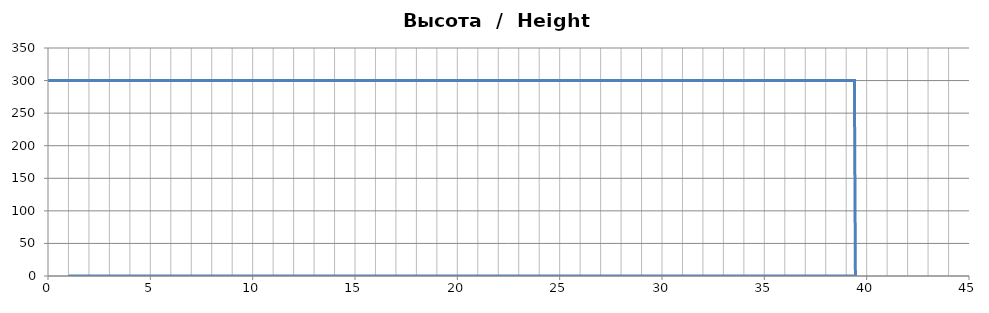
| Category | Высота  /  Height [m] |
|---|---|
| 0.0 | 300 |
| 0.05 | 300 |
| 0.1 | 300 |
| 0.15000000000000002 | 300 |
| 0.2 | 300 |
| 0.25 | 300 |
| 0.3 | 300 |
| 0.35 | 300 |
| 0.39999999999999997 | 300 |
| 0.44999999999999996 | 300 |
| 0.49999999999999994 | 300 |
| 0.5499999999999999 | 300 |
| 0.6 | 300 |
| 0.65 | 300 |
| 0.7000000000000001 | 300 |
| 0.7500000000000001 | 300 |
| 0.8000000000000002 | 300 |
| 0.8500000000000002 | 300 |
| 0.9000000000000002 | 300 |
| 0.9500000000000003 | 300 |
| 1.0000000000000002 | 300 |
| 1.0500000000000003 | 300 |
| 1.1000000000000003 | 300 |
| 1.1500000000000004 | 300 |
| 1.2000000000000004 | 300 |
| 1.2500000000000004 | 300 |
| 1.3000000000000005 | 300 |
| 1.3500000000000005 | 300 |
| 1.4000000000000006 | 300 |
| 1.4500000000000006 | 300 |
| 1.5000000000000007 | 300 |
| 1.5500000000000007 | 300 |
| 1.6000000000000008 | 300 |
| 1.6500000000000008 | 300 |
| 1.7000000000000008 | 300 |
| 1.7500000000000009 | 300 |
| 1.800000000000001 | 300 |
| 1.850000000000001 | 300 |
| 1.900000000000001 | 300 |
| 1.950000000000001 | 300 |
| 2.000000000000001 | 300 |
| 2.0500000000000007 | 300 |
| 2.1000000000000005 | 300 |
| 2.1500000000000004 | 300 |
| 2.2 | 300 |
| 2.25 | 300 |
| 2.3 | 300 |
| 2.3499999999999996 | 300 |
| 2.3999999999999995 | 300 |
| 2.4499999999999993 | 300 |
| 2.499999999999999 | 300 |
| 2.549999999999999 | 300 |
| 2.5999999999999988 | 300 |
| 2.6499999999999986 | 300 |
| 2.6999999999999984 | 300 |
| 2.7499999999999982 | 300 |
| 2.799999999999998 | 300 |
| 2.849999999999998 | 300 |
| 2.8999999999999977 | 300 |
| 2.9499999999999975 | 300 |
| 2.9999999999999973 | 300 |
| 3.049999999999997 | 300 |
| 3.099999999999997 | 300 |
| 3.149999999999997 | 300 |
| 3.1999999999999966 | 300 |
| 3.2499999999999964 | 300 |
| 3.2999999999999963 | 300 |
| 3.349999999999996 | 300 |
| 3.399999999999996 | 300 |
| 3.4499999999999957 | 300 |
| 3.4999999999999956 | 300 |
| 3.5499999999999954 | 300 |
| 3.599999999999995 | 300 |
| 3.649999999999995 | 300 |
| 3.699999999999995 | 300 |
| 3.7499999999999947 | 300 |
| 3.7999999999999945 | 300 |
| 3.8499999999999943 | 300 |
| 3.899999999999994 | 300 |
| 3.949999999999994 | 300 |
| 3.999999999999994 | 300 |
| 4.049999999999994 | 300 |
| 4.099999999999993 | 300 |
| 4.149999999999993 | 300 |
| 4.199999999999993 | 300 |
| 4.249999999999993 | 300 |
| 4.299999999999993 | 300 |
| 4.3499999999999925 | 300 |
| 4.399999999999992 | 300 |
| 4.449999999999992 | 300 |
| 4.499999999999992 | 300 |
| 4.549999999999992 | 300 |
| 4.599999999999992 | 300 |
| 4.6499999999999915 | 300 |
| 4.699999999999991 | 300 |
| 4.749999999999991 | 300 |
| 4.799999999999991 | 300 |
| 4.849999999999991 | 300 |
| 4.899999999999991 | 300 |
| 4.94999999999999 | 300 |
| 4.99999999999999 | 300 |
| 5.04999999999999 | 300 |
| 5.09999999999999 | 300 |
| 5.14999999999999 | 300 |
| 5.1999999999999895 | 300 |
| 5.249999999999989 | 300 |
| 5.299999999999989 | 300 |
| 5.349999999999989 | 300 |
| 5.399999999999989 | 300 |
| 5.449999999999989 | 300 |
| 5.4999999999999885 | 300 |
| 5.549999999999988 | 300 |
| 5.599999999999988 | 300 |
| 5.649999999999988 | 300 |
| 5.699999999999988 | 300 |
| 5.749999999999988 | 300 |
| 5.799999999999987 | 300 |
| 5.849999999999987 | 300 |
| 5.899999999999987 | 300 |
| 5.949999999999987 | 300 |
| 5.999999999999987 | 300 |
| 6.0499999999999865 | 300 |
| 6.099999999999986 | 300 |
| 6.149999999999986 | 300 |
| 6.199999999999986 | 300 |
| 6.249999999999986 | 300 |
| 6.299999999999986 | 300 |
| 6.349999999999985 | 300 |
| 6.399999999999985 | 300 |
| 6.449999999999985 | 300 |
| 6.499999999999985 | 300 |
| 6.549999999999985 | 300 |
| 6.5999999999999845 | 300 |
| 6.649999999999984 | 300 |
| 6.699999999999984 | 300 |
| 6.749999999999984 | 300 |
| 6.799999999999984 | 300 |
| 6.849999999999984 | 300 |
| 6.8999999999999835 | 300 |
| 6.949999999999983 | 300 |
| 6.999999999999983 | 300 |
| 7.049999999999983 | 300 |
| 7.099999999999983 | 300 |
| 7.149999999999983 | 300 |
| 7.199999999999982 | 300 |
| 7.249999999999982 | 300 |
| 7.299999999999982 | 300 |
| 7.349999999999982 | 300 |
| 7.399999999999982 | 300 |
| 7.4499999999999815 | 300 |
| 7.499999999999981 | 300 |
| 7.549999999999981 | 300 |
| 7.599999999999981 | 300 |
| 7.649999999999981 | 300 |
| 7.699999999999981 | 300 |
| 7.7499999999999805 | 300 |
| 7.79999999999998 | 300 |
| 7.84999999999998 | 300 |
| 7.89999999999998 | 300 |
| 7.94999999999998 | 300 |
| 7.99999999999998 | 300 |
| 8.04999999999998 | 300 |
| 8.09999999999998 | 300 |
| 8.14999999999998 | 300 |
| 8.199999999999982 | 300 |
| 8.249999999999982 | 300 |
| 8.299999999999983 | 300 |
| 8.349999999999984 | 300 |
| 8.399999999999984 | 300 |
| 8.449999999999985 | 300 |
| 8.499999999999986 | 300 |
| 8.549999999999986 | 300 |
| 8.599999999999987 | 300 |
| 8.649999999999988 | 300 |
| 8.699999999999989 | 300 |
| 8.74999999999999 | 300 |
| 8.79999999999999 | 300 |
| 8.84999999999999 | 300 |
| 8.899999999999991 | 300 |
| 8.949999999999992 | 300 |
| 8.999999999999993 | 300 |
| 9.049999999999994 | 300 |
| 9.099999999999994 | 300 |
| 9.149999999999995 | 300 |
| 9.199999999999996 | 300 |
| 9.249999999999996 | 300 |
| 9.299999999999997 | 300 |
| 9.349999999999998 | 300 |
| 9.399999999999999 | 300 |
| 9.45 | 300 |
| 9.5 | 300 |
| 9.55 | 300 |
| 9.600000000000001 | 300 |
| 9.650000000000002 | 300 |
| 9.700000000000003 | 300 |
| 9.750000000000004 | 300 |
| 9.800000000000004 | 300 |
| 9.850000000000005 | 300 |
| 9.900000000000006 | 300 |
| 9.950000000000006 | 300 |
| 10.000000000000007 | 300 |
| 10.050000000000008 | 300 |
| 10.100000000000009 | 300 |
| 10.15000000000001 | 300 |
| 10.20000000000001 | 300 |
| 10.25000000000001 | 300 |
| 10.300000000000011 | 300 |
| 10.350000000000012 | 300 |
| 10.400000000000013 | 300 |
| 10.450000000000014 | 300 |
| 10.500000000000014 | 300 |
| 10.550000000000015 | 300 |
| 10.600000000000016 | 300 |
| 10.650000000000016 | 300 |
| 10.700000000000017 | 300 |
| 10.750000000000018 | 300 |
| 10.800000000000018 | 300 |
| 10.85000000000002 | 300 |
| 10.90000000000002 | 300 |
| 10.95000000000002 | 300 |
| 11.000000000000021 | 300 |
| 11.050000000000022 | 300 |
| 11.100000000000023 | 300 |
| 11.150000000000023 | 300 |
| 11.200000000000024 | 300 |
| 11.250000000000025 | 300 |
| 11.300000000000026 | 300 |
| 11.350000000000026 | 300 |
| 11.400000000000027 | 300 |
| 11.450000000000028 | 300 |
| 11.500000000000028 | 300 |
| 11.55000000000003 | 300 |
| 11.60000000000003 | 300 |
| 11.65000000000003 | 300 |
| 11.700000000000031 | 300 |
| 11.750000000000032 | 300 |
| 11.800000000000033 | 300 |
| 11.850000000000033 | 300 |
| 11.900000000000034 | 300 |
| 11.950000000000035 | 300 |
| 12.000000000000036 | 300 |
| 12.050000000000036 | 300 |
| 12.100000000000037 | 300 |
| 12.150000000000038 | 300 |
| 12.200000000000038 | 300 |
| 12.250000000000039 | 300 |
| 12.30000000000004 | 300 |
| 12.35000000000004 | 300 |
| 12.400000000000041 | 300 |
| 12.450000000000042 | 300 |
| 12.500000000000043 | 300 |
| 12.550000000000043 | 300 |
| 12.600000000000044 | 300 |
| 12.650000000000045 | 300 |
| 12.700000000000045 | 300 |
| 12.750000000000046 | 300 |
| 12.800000000000047 | 300 |
| 12.850000000000048 | 300 |
| 12.900000000000048 | 300 |
| 12.950000000000049 | 300 |
| 13.00000000000005 | 300 |
| 13.05000000000005 | 300 |
| 13.100000000000051 | 300 |
| 13.150000000000052 | 300 |
| 13.200000000000053 | 300 |
| 13.250000000000053 | 300 |
| 13.300000000000054 | 300 |
| 13.350000000000055 | 300 |
| 13.400000000000055 | 300 |
| 13.450000000000056 | 300 |
| 13.500000000000057 | 300 |
| 13.550000000000058 | 300 |
| 13.600000000000058 | 300 |
| 13.650000000000059 | 300 |
| 13.70000000000006 | 300 |
| 13.75000000000006 | 300 |
| 13.800000000000061 | 300 |
| 13.850000000000062 | 300 |
| 13.900000000000063 | 300 |
| 13.950000000000063 | 300 |
| 14.000000000000064 | 300 |
| 14.050000000000065 | 300 |
| 14.100000000000065 | 300 |
| 14.150000000000066 | 300 |
| 14.200000000000067 | 300 |
| 14.250000000000068 | 300 |
| 14.300000000000068 | 300 |
| 14.350000000000069 | 300 |
| 14.40000000000007 | 300 |
| 14.45000000000007 | 300 |
| 14.500000000000071 | 300 |
| 14.550000000000072 | 300 |
| 14.600000000000072 | 300 |
| 14.650000000000073 | 300 |
| 14.700000000000074 | 300 |
| 14.750000000000075 | 300 |
| 14.800000000000075 | 300 |
| 14.850000000000076 | 300 |
| 14.900000000000077 | 300 |
| 14.950000000000077 | 300 |
| 15.000000000000078 | 300 |
| 15.050000000000079 | 300 |
| 15.10000000000008 | 300 |
| 15.15000000000008 | 300 |
| 15.200000000000081 | 300 |
| 15.250000000000082 | 300 |
| 15.300000000000082 | 300 |
| 15.350000000000083 | 300 |
| 15.400000000000084 | 300 |
| 15.450000000000085 | 300 |
| 15.500000000000085 | 300 |
| 15.550000000000086 | 300 |
| 15.600000000000087 | 300 |
| 15.650000000000087 | 300 |
| 15.700000000000088 | 300 |
| 15.750000000000089 | 300 |
| 15.80000000000009 | 300 |
| 15.85000000000009 | 300 |
| 15.900000000000091 | 300 |
| 15.950000000000092 | 300 |
| 16.000000000000092 | 300 |
| 16.050000000000093 | 300 |
| 16.100000000000094 | 300 |
| 16.150000000000095 | 300 |
| 16.200000000000095 | 300 |
| 16.250000000000096 | 300 |
| 16.300000000000097 | 300 |
| 16.350000000000097 | 300 |
| 16.400000000000098 | 300 |
| 16.4500000000001 | 300 |
| 16.5000000000001 | 300 |
| 16.5500000000001 | 300 |
| 16.6000000000001 | 300 |
| 16.6500000000001 | 300 |
| 16.700000000000102 | 300 |
| 16.750000000000103 | 300 |
| 16.800000000000104 | 300 |
| 16.850000000000104 | 300 |
| 16.900000000000105 | 300 |
| 16.950000000000106 | 300 |
| 17.000000000000107 | 300 |
| 17.050000000000107 | 300 |
| 17.100000000000108 | 300 |
| 17.15000000000011 | 300 |
| 17.20000000000011 | 300 |
| 17.25000000000011 | 300 |
| 17.30000000000011 | 300 |
| 17.35000000000011 | 300 |
| 17.400000000000112 | 300 |
| 17.450000000000113 | 300 |
| 17.500000000000114 | 300 |
| 17.550000000000114 | 300 |
| 17.600000000000115 | 300 |
| 17.650000000000116 | 300 |
| 17.700000000000117 | 300 |
| 17.750000000000117 | 300 |
| 17.800000000000118 | 300 |
| 17.85000000000012 | 300 |
| 17.90000000000012 | 300 |
| 17.95000000000012 | 300 |
| 18.00000000000012 | 300 |
| 18.05000000000012 | 300 |
| 18.100000000000122 | 300 |
| 18.150000000000123 | 300 |
| 18.200000000000124 | 300 |
| 18.250000000000124 | 300 |
| 18.300000000000125 | 300 |
| 18.350000000000126 | 300 |
| 18.400000000000126 | 300 |
| 18.450000000000127 | 300 |
| 18.500000000000128 | 300 |
| 18.55000000000013 | 300 |
| 18.60000000000013 | 300 |
| 18.65000000000013 | 300 |
| 18.70000000000013 | 300 |
| 18.75000000000013 | 300 |
| 18.800000000000132 | 300 |
| 18.850000000000133 | 300 |
| 18.900000000000134 | 300 |
| 18.950000000000134 | 300 |
| 19.000000000000135 | 300 |
| 19.050000000000136 | 300 |
| 19.100000000000136 | 300 |
| 19.150000000000137 | 300 |
| 19.200000000000138 | 300 |
| 19.25000000000014 | 300 |
| 19.30000000000014 | 300 |
| 19.35000000000014 | 300 |
| 19.40000000000014 | 300 |
| 19.45000000000014 | 300 |
| 19.500000000000142 | 300 |
| 19.550000000000143 | 300 |
| 19.600000000000144 | 300 |
| 19.650000000000144 | 300 |
| 19.700000000000145 | 300 |
| 19.750000000000146 | 300 |
| 19.800000000000146 | 300 |
| 19.850000000000147 | 300 |
| 19.900000000000148 | 300 |
| 19.95000000000015 | 300 |
| 20.00000000000015 | 300 |
| 20.05000000000015 | 300 |
| 20.10000000000015 | 300 |
| 20.15000000000015 | 300 |
| 20.200000000000152 | 300 |
| 20.250000000000153 | 300 |
| 20.300000000000153 | 300 |
| 20.350000000000154 | 300 |
| 20.400000000000155 | 300 |
| 20.450000000000156 | 300 |
| 20.500000000000156 | 300 |
| 20.550000000000157 | 300 |
| 20.600000000000158 | 300 |
| 20.65000000000016 | 300 |
| 20.70000000000016 | 300 |
| 20.75000000000016 | 300 |
| 20.80000000000016 | 300 |
| 20.85000000000016 | 300 |
| 20.900000000000162 | 300 |
| 20.950000000000163 | 300 |
| 21.000000000000163 | 300 |
| 21.050000000000164 | 300 |
| 21.100000000000165 | 300 |
| 21.150000000000166 | 300 |
| 21.200000000000166 | 300 |
| 21.250000000000167 | 300 |
| 21.300000000000168 | 300 |
| 21.35000000000017 | 300 |
| 21.40000000000017 | 300 |
| 21.45000000000017 | 300 |
| 21.50000000000017 | 300 |
| 21.55000000000017 | 300 |
| 21.600000000000172 | 300 |
| 21.650000000000173 | 300 |
| 21.700000000000173 | 300 |
| 21.750000000000174 | 300 |
| 21.800000000000175 | 300 |
| 21.850000000000176 | 300 |
| 21.900000000000176 | 300 |
| 21.950000000000177 | 300 |
| 22.000000000000178 | 300 |
| 22.05000000000018 | 300 |
| 22.10000000000018 | 300 |
| 22.15000000000018 | 300 |
| 22.20000000000018 | 300 |
| 22.25000000000018 | 300 |
| 22.300000000000182 | 300 |
| 22.350000000000183 | 300 |
| 22.400000000000183 | 300 |
| 22.450000000000184 | 300 |
| 22.500000000000185 | 300 |
| 22.550000000000185 | 300 |
| 22.600000000000186 | 300 |
| 22.650000000000187 | 300 |
| 22.700000000000188 | 300 |
| 22.75000000000019 | 300 |
| 22.80000000000019 | 300 |
| 22.85000000000019 | 300 |
| 22.90000000000019 | 300 |
| 22.95000000000019 | 300 |
| 23.000000000000192 | 300 |
| 23.050000000000193 | 300 |
| 23.100000000000193 | 300 |
| 23.150000000000194 | 300 |
| 23.200000000000195 | 300 |
| 23.250000000000195 | 300 |
| 23.300000000000196 | 300 |
| 23.350000000000197 | 300 |
| 23.400000000000198 | 300 |
| 23.4500000000002 | 300 |
| 23.5000000000002 | 300 |
| 23.5500000000002 | 300 |
| 23.6000000000002 | 300 |
| 23.6500000000002 | 300 |
| 23.700000000000202 | 300 |
| 23.750000000000203 | 300 |
| 23.800000000000203 | 300 |
| 23.850000000000204 | 300 |
| 23.900000000000205 | 300 |
| 23.950000000000205 | 300 |
| 24.000000000000206 | 300 |
| 24.050000000000207 | 300 |
| 24.100000000000207 | 300 |
| 24.150000000000208 | 300 |
| 24.20000000000021 | 300 |
| 24.25000000000021 | 300 |
| 24.30000000000021 | 300 |
| 24.35000000000021 | 300 |
| 24.40000000000021 | 300 |
| 24.450000000000212 | 300 |
| 24.500000000000213 | 300 |
| 24.550000000000214 | 300 |
| 24.600000000000215 | 300 |
| 24.650000000000215 | 300 |
| 24.700000000000216 | 300 |
| 24.750000000000217 | 300 |
| 24.800000000000217 | 300 |
| 24.850000000000218 | 300 |
| 24.90000000000022 | 300 |
| 24.95000000000022 | 300 |
| 25.00000000000022 | 300 |
| 25.05000000000022 | 300 |
| 25.10000000000022 | 300 |
| 25.150000000000222 | 300 |
| 25.200000000000223 | 300 |
| 25.250000000000224 | 300 |
| 25.300000000000225 | 300 |
| 25.350000000000225 | 300 |
| 25.400000000000226 | 300 |
| 25.450000000000227 | 300 |
| 25.500000000000227 | 300 |
| 25.550000000000228 | 300 |
| 25.60000000000023 | 300 |
| 25.65000000000023 | 300 |
| 25.70000000000023 | 300 |
| 25.75000000000023 | 300 |
| 25.80000000000023 | 300 |
| 25.850000000000232 | 300 |
| 25.900000000000233 | 300 |
| 25.950000000000234 | 300 |
| 26.000000000000234 | 300 |
| 26.050000000000235 | 300 |
| 26.100000000000236 | 300 |
| 26.150000000000237 | 300 |
| 26.200000000000237 | 300 |
| 26.250000000000238 | 300 |
| 26.30000000000024 | 300 |
| 26.35000000000024 | 300 |
| 26.40000000000024 | 300 |
| 26.45000000000024 | 300 |
| 26.50000000000024 | 300 |
| 26.550000000000242 | 300 |
| 26.600000000000243 | 300 |
| 26.650000000000244 | 300 |
| 26.700000000000244 | 300 |
| 26.750000000000245 | 300 |
| 26.800000000000246 | 300 |
| 26.850000000000247 | 300 |
| 26.900000000000247 | 300 |
| 26.950000000000248 | 300 |
| 27.00000000000025 | 300 |
| 27.05000000000025 | 300 |
| 27.10000000000025 | 300 |
| 27.15000000000025 | 300 |
| 27.20000000000025 | 300 |
| 27.250000000000252 | 300 |
| 27.300000000000253 | 300 |
| 27.350000000000254 | 300 |
| 27.400000000000254 | 300 |
| 27.450000000000255 | 300 |
| 27.500000000000256 | 300 |
| 27.550000000000257 | 300 |
| 27.600000000000257 | 300 |
| 27.650000000000258 | 300 |
| 27.70000000000026 | 300 |
| 27.75000000000026 | 300 |
| 27.80000000000026 | 300 |
| 27.85000000000026 | 300 |
| 27.90000000000026 | 300 |
| 27.950000000000262 | 300 |
| 28.000000000000263 | 300 |
| 28.050000000000264 | 300 |
| 28.100000000000264 | 300 |
| 28.150000000000265 | 300 |
| 28.200000000000266 | 300 |
| 28.250000000000266 | 300 |
| 28.300000000000267 | 300 |
| 28.350000000000268 | 300 |
| 28.40000000000027 | 300 |
| 28.45000000000027 | 300 |
| 28.50000000000027 | 300 |
| 28.55000000000027 | 300 |
| 28.60000000000027 | 300 |
| 28.650000000000272 | 300 |
| 28.700000000000273 | 300 |
| 28.750000000000274 | 300 |
| 28.800000000000274 | 300 |
| 28.850000000000275 | 300 |
| 28.900000000000276 | 300 |
| 28.950000000000276 | 300 |
| 29.000000000000277 | 300 |
| 29.050000000000278 | 300 |
| 29.10000000000028 | 300 |
| 29.15000000000028 | 300 |
| 29.20000000000028 | 300 |
| 29.25000000000028 | 300 |
| 29.30000000000028 | 300 |
| 29.350000000000282 | 300 |
| 29.400000000000283 | 300 |
| 29.450000000000284 | 300 |
| 29.500000000000284 | 300 |
| 29.550000000000285 | 300 |
| 29.600000000000286 | 300 |
| 29.650000000000286 | 300 |
| 29.700000000000287 | 300 |
| 29.750000000000288 | 300 |
| 29.80000000000029 | 300 |
| 29.85000000000029 | 300 |
| 29.90000000000029 | 300 |
| 29.95000000000029 | 300 |
| 30.00000000000029 | 300 |
| 30.050000000000292 | 300 |
| 30.100000000000293 | 300 |
| 30.150000000000293 | 300 |
| 30.200000000000294 | 300 |
| 30.250000000000295 | 300 |
| 30.300000000000296 | 300 |
| 30.350000000000296 | 300 |
| 30.400000000000297 | 300 |
| 30.450000000000298 | 300 |
| 30.5000000000003 | 300 |
| 30.5500000000003 | 300 |
| 30.6000000000003 | 300 |
| 30.6500000000003 | 300 |
| 30.7000000000003 | 300 |
| 30.750000000000302 | 300 |
| 30.800000000000303 | 300 |
| 30.850000000000303 | 300 |
| 30.900000000000304 | 300 |
| 30.950000000000305 | 300 |
| 31.000000000000306 | 300 |
| 31.050000000000306 | 300 |
| 31.100000000000307 | 300 |
| 31.150000000000308 | 300 |
| 31.20000000000031 | 300 |
| 31.25000000000031 | 300 |
| 31.30000000000031 | 300 |
| 31.35000000000031 | 300 |
| 31.40000000000031 | 300 |
| 31.450000000000312 | 300 |
| 31.500000000000313 | 300 |
| 31.550000000000313 | 300 |
| 31.600000000000314 | 300 |
| 31.650000000000315 | 300 |
| 31.700000000000315 | 300 |
| 31.750000000000316 | 300 |
| 31.800000000000317 | 300 |
| 31.850000000000318 | 300 |
| 31.90000000000032 | 300 |
| 31.95000000000032 | 300 |
| 32.00000000000032 | 300 |
| 32.05000000000032 | 300 |
| 32.100000000000314 | 300 |
| 32.15000000000031 | 300 |
| 32.20000000000031 | 300 |
| 32.250000000000306 | 300 |
| 32.3000000000003 | 300 |
| 32.3500000000003 | 300 |
| 32.4000000000003 | 300 |
| 32.450000000000294 | 300 |
| 32.50000000000029 | 300 |
| 32.55000000000029 | 300 |
| 32.600000000000286 | 300 |
| 32.65000000000028 | 300 |
| 32.70000000000028 | 300 |
| 32.75000000000028 | 300 |
| 32.800000000000274 | 300 |
| 32.85000000000027 | 300 |
| 32.90000000000027 | 300 |
| 32.950000000000266 | 300 |
| 33.00000000000026 | 300 |
| 33.05000000000026 | 300 |
| 33.10000000000026 | 300 |
| 33.150000000000254 | 300 |
| 33.20000000000025 | 300 |
| 33.25000000000025 | 300 |
| 33.300000000000246 | 300 |
| 33.35000000000024 | 300 |
| 33.40000000000024 | 300 |
| 33.45000000000024 | 300 |
| 33.500000000000234 | 300 |
| 33.55000000000023 | 300 |
| 33.60000000000023 | 300 |
| 33.650000000000226 | 300 |
| 33.70000000000022 | 300 |
| 33.75000000000022 | 300 |
| 33.80000000000022 | 300 |
| 33.850000000000215 | 300 |
| 33.90000000000021 | 300 |
| 33.95000000000021 | 300 |
| 34.000000000000206 | 300 |
| 34.0500000000002 | 300 |
| 34.1000000000002 | 300 |
| 34.1500000000002 | 300 |
| 34.200000000000195 | 300 |
| 34.25000000000019 | 300 |
| 34.30000000000019 | 300 |
| 34.350000000000186 | 300 |
| 34.40000000000018 | 300 |
| 34.45000000000018 | 300 |
| 34.50000000000018 | 300 |
| 34.550000000000175 | 300 |
| 34.60000000000017 | 300 |
| 34.65000000000017 | 300 |
| 34.700000000000166 | 300 |
| 34.75000000000016 | 300 |
| 34.80000000000016 | 300 |
| 34.85000000000016 | 300 |
| 34.900000000000155 | 300 |
| 34.95000000000015 | 300 |
| 35.00000000000015 | 300 |
| 35.050000000000146 | 300 |
| 35.10000000000014 | 300 |
| 35.15000000000014 | 300 |
| 35.20000000000014 | 300 |
| 35.250000000000135 | 300 |
| 35.30000000000013 | 300 |
| 35.35000000000013 | 300 |
| 35.40000000000013 | 300 |
| 35.450000000000124 | 300 |
| 35.50000000000012 | 300 |
| 35.55000000000012 | 300 |
| 35.600000000000115 | 300 |
| 35.65000000000011 | 300 |
| 35.70000000000011 | 300 |
| 35.75000000000011 | 300 |
| 35.800000000000104 | 300 |
| 35.8500000000001 | 300 |
| 35.9000000000001 | 300 |
| 35.950000000000095 | 300 |
| 36.00000000000009 | 300 |
| 36.05000000000009 | 300 |
| 36.10000000000009 | 300 |
| 36.150000000000084 | 300 |
| 36.20000000000008 | 300 |
| 36.25000000000008 | 300 |
| 36.300000000000075 | 300 |
| 36.35000000000007 | 300 |
| 36.40000000000007 | 300 |
| 36.45000000000007 | 300 |
| 36.500000000000064 | 300 |
| 36.55000000000006 | 300 |
| 36.60000000000006 | 300 |
| 36.650000000000055 | 300 |
| 36.70000000000005 | 300 |
| 36.75000000000005 | 300 |
| 36.80000000000005 | 300 |
| 36.850000000000044 | 300 |
| 36.90000000000004 | 300 |
| 36.95000000000004 | 300 |
| 37.000000000000036 | 300 |
| 37.05000000000003 | 300 |
| 37.10000000000003 | 300 |
| 37.15000000000003 | 300 |
| 37.200000000000024 | 300 |
| 37.25000000000002 | 300 |
| 37.30000000000002 | 300 |
| 37.350000000000016 | 300 |
| 37.40000000000001 | 300 |
| 37.45000000000001 | 300 |
| 37.50000000000001 | 300 |
| 37.550000000000004 | 300 |
| 37.6 | 300 |
| 37.65 | 300 |
| 37.699999999999996 | 300 |
| 37.74999999999999 | 300 |
| 37.79999999999999 | 300 |
| 37.84999999999999 | 300 |
| 37.899999999999984 | 300 |
| 37.94999999999998 | 300 |
| 37.99999999999998 | 300 |
| 38.049999999999976 | 300 |
| 38.09999999999997 | 300 |
| 38.14999999999997 | 300 |
| 38.19999999999997 | 300 |
| 38.249999999999964 | 300 |
| 38.29999999999996 | 300 |
| 38.34999999999996 | 300 |
| 38.399999999999956 | 300 |
| 38.44999999999995 | 300 |
| 38.49999999999995 | 300 |
| 38.54999999999995 | 300 |
| 38.599999999999945 | 300 |
| 38.64999999999994 | 300 |
| 38.69999999999994 | 300 |
| 38.749999999999936 | 300 |
| 38.79999999999993 | 300 |
| 38.84999999999993 | 300 |
| 38.89999999999993 | 300 |
| 38.949999999999925 | 300 |
| 38.99999999999992 | 300 |
| 39.04999999999992 | 300 |
| 39.099999999999916 | 300 |
| 39.14999999999991 | 300 |
| 39.19999999999991 | 300 |
| 39.24999999999991 | 300 |
| 39.299999999999905 | 300 |
| 39.3499999999999 | 300 |
| 39.3999999999999 | 300 |
| 39.449999999999896 | 0 |
| 1.0 | 0 |
| 1.0 | 0 |
| 1.0 | 0 |
| 1.0 | 0 |
| 1.0 | 0 |
| 1.0 | 0 |
| 1.0 | 0 |
| 1.0 | 0 |
| 1.0 | 0 |
| 1.0 | 0 |
| 1.0 | 0 |
| 1.0 | 0 |
| 1.0 | 0 |
| 1.0 | 0 |
| 1.0 | 0 |
| 1.0 | 0 |
| 1.0 | 0 |
| 1.0 | 0 |
| 1.0 | 0 |
| 1.0 | 0 |
| 1.0 | 0 |
| 1.0 | 0 |
| 1.0 | 0 |
| 1.0 | 0 |
| 1.0 | 0 |
| 1.0 | 0 |
| 1.0 | 0 |
| 1.0 | 0 |
| 1.0 | 0 |
| 1.0 | 0 |
| 1.0 | 0 |
| 1.0 | 0 |
| 1.0 | 0 |
| 1.0 | 0 |
| 1.0 | 0 |
| 1.0 | 0 |
| 1.0 | 0 |
| 1.0 | 0 |
| 1.0 | 0 |
| 1.0 | 0 |
| 1.0 | 0 |
| 1.0 | 0 |
| 1.0 | 0 |
| 1.0 | 0 |
| 1.0 | 0 |
| 1.0 | 0 |
| 1.0 | 0 |
| 1.0 | 0 |
| 1.0 | 0 |
| 1.0 | 0 |
| 1.0 | 0 |
| 1.0 | 0 |
| 1.0 | 0 |
| 1.0 | 0 |
| 1.0 | 0 |
| 1.0 | 0 |
| 1.0 | 0 |
| 1.0 | 0 |
| 1.0 | 0 |
| 1.0 | 0 |
| 1.0 | 0 |
| 1.0 | 0 |
| 1.0 | 0 |
| 1.0 | 0 |
| 1.0 | 0 |
| 1.0 | 0 |
| 1.0 | 0 |
| 1.0 | 0 |
| 1.0 | 0 |
| 1.0 | 0 |
| 1.0 | 0 |
| 1.0 | 0 |
| 1.0 | 0 |
| 1.0 | 0 |
| 1.0 | 0 |
| 1.0 | 0 |
| 1.0 | 0 |
| 1.0 | 0 |
| 1.0 | 0 |
| 1.0 | 0 |
| 1.0 | 0 |
| 1.0 | 0 |
| 1.0 | 0 |
| 1.0 | 0 |
| 1.0 | 0 |
| 1.0 | 0 |
| 1.0 | 0 |
| 1.0 | 0 |
| 1.0 | 0 |
| 1.0 | 0 |
| 1.0 | 0 |
| 1.0 | 0 |
| 1.0 | 0 |
| 1.0 | 0 |
| 1.0 | 0 |
| 1.0 | 0 |
| 1.0 | 0 |
| 1.0 | 0 |
| 1.0 | 0 |
| 1.0 | 0 |
| 1.0 | 0 |
| 1.0 | 0 |
| 1.0 | 0 |
| 1.0 | 0 |
| 1.0 | 0 |
| 1.0 | 0 |
| 1.0 | 0 |
| 1.0 | 0 |
| 1.0 | 0 |
| 1.0 | 0 |
| 1.0 | 0 |
| 1.0 | 0 |
| 1.0 | 0 |
| 1.0 | 0 |
| 1.0 | 0 |
| 1.0 | 0 |
| 1.0 | 0 |
| 1.0 | 0 |
| 1.0 | 0 |
| 1.0 | 0 |
| 1.0 | 0 |
| 1.0 | 0 |
| 1.0 | 0 |
| 1.0 | 0 |
| 1.0 | 0 |
| 1.0 | 0 |
| 1.0 | 0 |
| 1.0 | 0 |
| 1.0 | 0 |
| 1.0 | 0 |
| 1.0 | 0 |
| 1.0 | 0 |
| 1.0 | 0 |
| 1.0 | 0 |
| 1.0 | 0 |
| 1.0 | 0 |
| 1.0 | 0 |
| 1.0 | 0 |
| 1.0 | 0 |
| 1.0 | 0 |
| 1.0 | 0 |
| 1.0 | 0 |
| 1.0 | 0 |
| 1.0 | 0 |
| 1.0 | 0 |
| 1.0 | 0 |
| 1.0 | 0 |
| 1.0 | 0 |
| 1.0 | 0 |
| 1.0 | 0 |
| 1.0 | 0 |
| 1.0 | 0 |
| 1.0 | 0 |
| 1.0 | 0 |
| 1.0 | 0 |
| 1.0 | 0 |
| 1.0 | 0 |
| 1.0 | 0 |
| 1.0 | 0 |
| 1.0 | 0 |
| 1.0 | 0 |
| 1.0 | 0 |
| 1.0 | 0 |
| 1.0 | 0 |
| 1.0 | 0 |
| 1.0 | 0 |
| 1.0 | 0 |
| 1.0 | 0 |
| 1.0 | 0 |
| 1.0 | 0 |
| 1.0 | 0 |
| 1.0 | 0 |
| 1.0 | 0 |
| 1.0 | 0 |
| 1.0 | 0 |
| 1.0 | 0 |
| 1.0 | 0 |
| 1.0 | 0 |
| 1.0 | 0 |
| 1.0 | 0 |
| 1.0 | 0 |
| 1.0 | 0 |
| 1.0 | 0 |
| 1.0 | 0 |
| 1.0 | 0 |
| 1.0 | 0 |
| 1.0 | 0 |
| 1.0 | 0 |
| 1.0 | 0 |
| 1.0 | 0 |
| 1.0 | 0 |
| 1.0 | 0 |
| 1.0 | 0 |
| 1.0 | 0 |
| 1.0 | 0 |
| 1.0 | 0 |
| 1.0 | 0 |
| 1.0 | 0 |
| 1.0 | 0 |
| 1.0 | 0 |
| 1.0 | 0 |
| 1.0 | 0 |
| 1.0 | 0 |
| 1.0 | 0 |
| 1.0 | 0 |
| 1.0 | 0 |
| 1.0 | 0 |
| 1.0 | 0 |
| 1.0 | 0 |
| 1.0 | 0 |
| 1.0 | 0 |
| 1.0 | 0 |
| 1.0 | 0 |
| 1.0 | 0 |
| 1.0 | 0 |
| 1.0 | 0 |
| 1.0 | 0 |
| 1.0 | 0 |
| 1.0 | 0 |
| 1.0 | 0 |
| 1.0 | 0 |
| 1.0 | 0 |
| 1.0 | 0 |
| 1.0 | 0 |
| 1.0 | 0 |
| 1.0 | 0 |
| 1.0 | 0 |
| 1.0 | 0 |
| 1.0 | 0 |
| 1.0 | 0 |
| 1.0 | 0 |
| 1.0 | 0 |
| 1.0 | 0 |
| 1.0 | 0 |
| 1.0 | 0 |
| 1.0 | 0 |
| 1.0 | 0 |
| 1.0 | 0 |
| 1.0 | 0 |
| 1.0 | 0 |
| 1.0 | 0 |
| 1.0 | 0 |
| 1.0 | 0 |
| 1.0 | 0 |
| 1.0 | 0 |
| 1.0 | 0 |
| 1.0 | 0 |
| 1.0 | 0 |
| 1.0 | 0 |
| 1.0 | 0 |
| 1.0 | 0 |
| 1.0 | 0 |
| 1.0 | 0 |
| 1.0 | 0 |
| 1.0 | 0 |
| 1.0 | 0 |
| 1.0 | 0 |
| 1.0 | 0 |
| 1.0 | 0 |
| 1.0 | 0 |
| 1.0 | 0 |
| 1.0 | 0 |
| 1.0 | 0 |
| 1.0 | 0 |
| 1.0 | 0 |
| 1.0 | 0 |
| 1.0 | 0 |
| 1.0 | 0 |
| 1.0 | 0 |
| 1.0 | 0 |
| 1.0 | 0 |
| 1.0 | 0 |
| 1.0 | 0 |
| 1.0 | 0 |
| 1.0 | 0 |
| 1.0 | 0 |
| 1.0 | 0 |
| 1.0 | 0 |
| 1.0 | 0 |
| 1.0 | 0 |
| 1.0 | 0 |
| 1.0 | 0 |
| 1.0 | 0 |
| 1.0 | 0 |
| 1.0 | 0 |
| 1.0 | 0 |
| 1.0 | 0 |
| 1.0 | 0 |
| 1.0 | 0 |
| 1.0 | 0 |
| 1.0 | 0 |
| 1.0 | 0 |
| 1.0 | 0 |
| 1.0 | 0 |
| 1.0 | 0 |
| 1.0 | 0 |
| 1.0 | 0 |
| 1.0 | 0 |
| 1.0 | 0 |
| 1.0 | 0 |
| 1.0 | 0 |
| 1.0 | 0 |
| 1.0 | 0 |
| 1.0 | 0 |
| 1.0 | 0 |
| 1.0 | 0 |
| 1.0 | 0 |
| 1.0 | 0 |
| 1.0 | 0 |
| 1.0 | 0 |
| 1.0 | 0 |
| 1.0 | 0 |
| 1.0 | 0 |
| 1.0 | 0 |
| 1.0 | 0 |
| 1.0 | 0 |
| 1.0 | 0 |
| 1.0 | 0 |
| 1.0 | 0 |
| 1.0 | 0 |
| 1.0 | 0 |
| 1.0 | 0 |
| 1.0 | 0 |
| 1.0 | 0 |
| 1.0 | 0 |
| 1.0 | 0 |
| 1.0 | 0 |
| 1.0 | 0 |
| 1.0 | 0 |
| 1.0 | 0 |
| 1.0 | 0 |
| 1.0 | 0 |
| 1.0 | 0 |
| 1.0 | 0 |
| 1.0 | 0 |
| 1.0 | 0 |
| 1.0 | 0 |
| 1.0 | 0 |
| 1.0 | 0 |
| 1.0 | 0 |
| 1.0 | 0 |
| 1.0 | 0 |
| 1.0 | 0 |
| 1.0 | 0 |
| 1.0 | 0 |
| 1.0 | 0 |
| 1.0 | 0 |
| 1.0 | 0 |
| 1.0 | 0 |
| 1.0 | 0 |
| 1.0 | 0 |
| 1.0 | 0 |
| 1.0 | 0 |
| 1.0 | 0 |
| 1.0 | 0 |
| 1.0 | 0 |
| 1.0 | 0 |
| 1.0 | 0 |
| 1.0 | 0 |
| 1.0 | 0 |
| 1.0 | 0 |
| 1.0 | 0 |
| 1.0 | 0 |
| 1.0 | 0 |
| 1.0 | 0 |
| 1.0 | 0 |
| 1.0 | 0 |
| 1.0 | 0 |
| 1.0 | 0 |
| 1.0 | 0 |
| 1.0 | 0 |
| 1.0 | 0 |
| 1.0 | 0 |
| 1.0 | 0 |
| 1.0 | 0 |
| 1.0 | 0 |
| 1.0 | 0 |
| 1.0 | 0 |
| 1.0 | 0 |
| 1.0 | 0 |
| 1.0 | 0 |
| 1.0 | 0 |
| 1.0 | 0 |
| 1.0 | 0 |
| 1.0 | 0 |
| 1.0 | 0 |
| 1.0 | 0 |
| 1.0 | 0 |
| 1.0 | 0 |
| 1.0 | 0 |
| 1.0 | 0 |
| 1.0 | 0 |
| 1.0 | 0 |
| 1.0 | 0 |
| 1.0 | 0 |
| 1.0 | 0 |
| 1.0 | 0 |
| 1.0 | 0 |
| 1.0 | 0 |
| 1.0 | 0 |
| 1.0 | 0 |
| 1.0 | 0 |
| 1.0 | 0 |
| 1.0 | 0 |
| 1.0 | 0 |
| 1.0 | 0 |
| 1.0 | 0 |
| 1.0 | 0 |
| 1.0 | 0 |
| 1.0 | 0 |
| 1.0 | 0 |
| 1.0 | 0 |
| 1.0 | 0 |
| 1.0 | 0 |
| 1.0 | 0 |
| 1.0 | 0 |
| 1.0 | 0 |
| 1.0 | 0 |
| 1.0 | 0 |
| 1.0 | 0 |
| 1.0 | 0 |
| 1.0 | 0 |
| 1.0 | 0 |
| 1.0 | 0 |
| 1.0 | 0 |
| 1.0 | 0 |
| 1.0 | 0 |
| 1.0 | 0 |
| 1.0 | 0 |
| 1.0 | 0 |
| 1.0 | 0 |
| 1.0 | 0 |
| 1.0 | 0 |
| 1.0 | 0 |
| 1.0 | 0 |
| 1.0 | 0 |
| 1.0 | 0 |
| 1.0 | 0 |
| 1.0 | 0 |
| 1.0 | 0 |
| 1.0 | 0 |
| 1.0 | 0 |
| 1.0 | 0 |
| 1.0 | 0 |
| 1.0 | 0 |
| 1.0 | 0 |
| 1.0 | 0 |
| 1.0 | 0 |
| 1.0 | 0 |
| 1.0 | 0 |
| 1.0 | 0 |
| 1.0 | 0 |
| 1.0 | 0 |
| 1.0 | 0 |
| 1.0 | 0 |
| 1.0 | 0 |
| 1.0 | 0 |
| 1.0 | 0 |
| 1.0 | 0 |
| 1.0 | 0 |
| 1.0 | 0 |
| 1.0 | 0 |
| 1.0 | 0 |
| 1.0 | 0 |
| 1.0 | 0 |
| 1.0 | 0 |
| 1.0 | 0 |
| 1.0 | 0 |
| 1.0 | 0 |
| 1.0 | 0 |
| 1.0 | 0 |
| 1.0 | 0 |
| 1.0 | 0 |
| 1.0 | 0 |
| 1.0 | 0 |
| 1.0 | 0 |
| 1.0 | 0 |
| 1.0 | 0 |
| 1.0 | 0 |
| 1.0 | 0 |
| 1.0 | 0 |
| 1.0 | 0 |
| 1.0 | 0 |
| 1.0 | 0 |
| 1.0 | 0 |
| 1.0 | 0 |
| 1.0 | 0 |
| 1.0 | 0 |
| 1.0 | 0 |
| 1.0 | 0 |
| 1.0 | 0 |
| 1.0 | 0 |
| 1.0 | 0 |
| 1.0 | 0 |
| 1.0 | 0 |
| 1.0 | 0 |
| 1.0 | 0 |
| 1.0 | 0 |
| 1.0 | 0 |
| 1.0 | 0 |
| 1.0 | 0 |
| 1.0 | 0 |
| 1.0 | 0 |
| 1.0 | 0 |
| 1.0 | 0 |
| 1.0 | 0 |
| 1.0 | 0 |
| 1.0 | 0 |
| 1.0 | 0 |
| 1.0 | 0 |
| 1.0 | 0 |